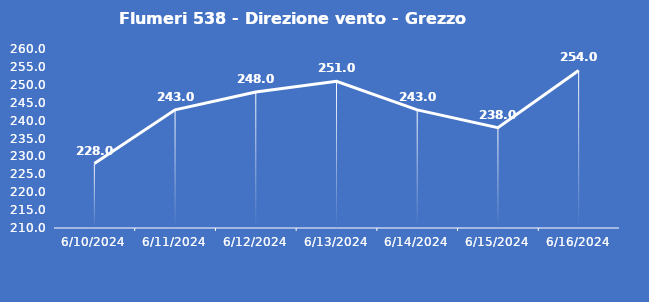
| Category | Flumeri 538 - Direzione vento - Grezzo (°N) |
|---|---|
| 6/10/24 | 228 |
| 6/11/24 | 243 |
| 6/12/24 | 248 |
| 6/13/24 | 251 |
| 6/14/24 | 243 |
| 6/15/24 | 238 |
| 6/16/24 | 254 |